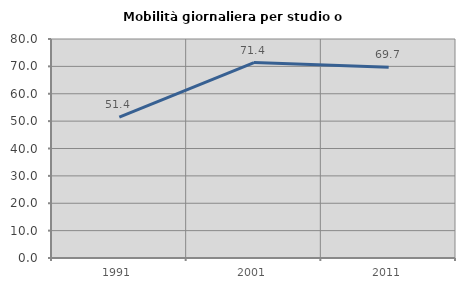
| Category | Mobilità giornaliera per studio o lavoro |
|---|---|
| 1991.0 | 51.449 |
| 2001.0 | 71.41 |
| 2011.0 | 69.68 |